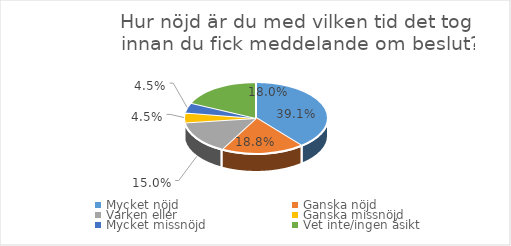
| Category | Series 0 |
|---|---|
| Mycket nöjd  | 0.391 |
| Ganska nöjd | 0.188 |
| Varken eller  | 0.15 |
| Ganska missnöjd | 0.045 |
| Mycket missnöjd  | 0.045 |
| Vet inte/ingen åsikt | 0.18 |